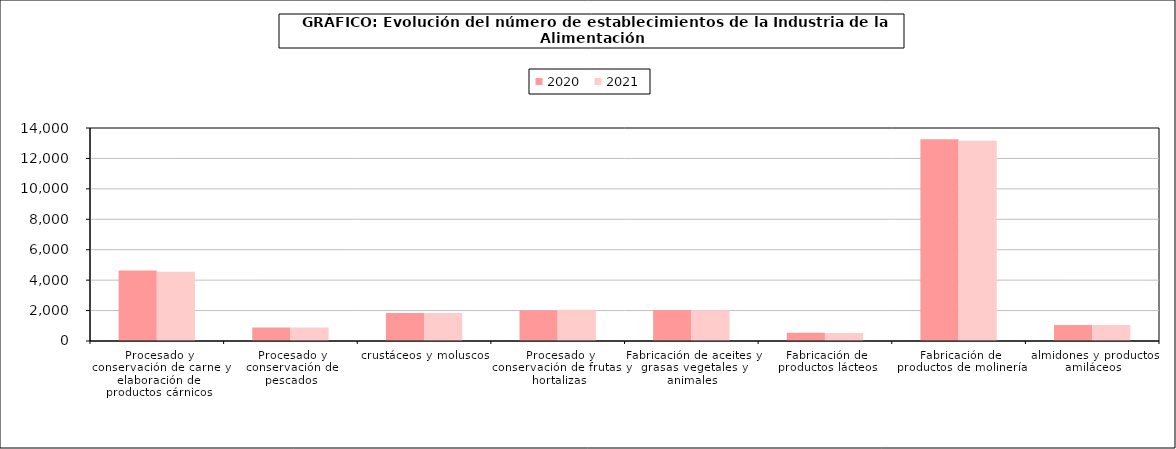
| Category | 2020 | 2021 |
|---|---|---|
| 0 | 4640 | 4550 |
| 1 | 881 | 885 |
| 2 | 1842 | 1843 |
| 3 | 2026 | 2056 |
| 4 | 2043 | 2015 |
| 5 | 537 | 522 |
| 6 | 13259 | 13157 |
| 7 | 1050 | 1047 |